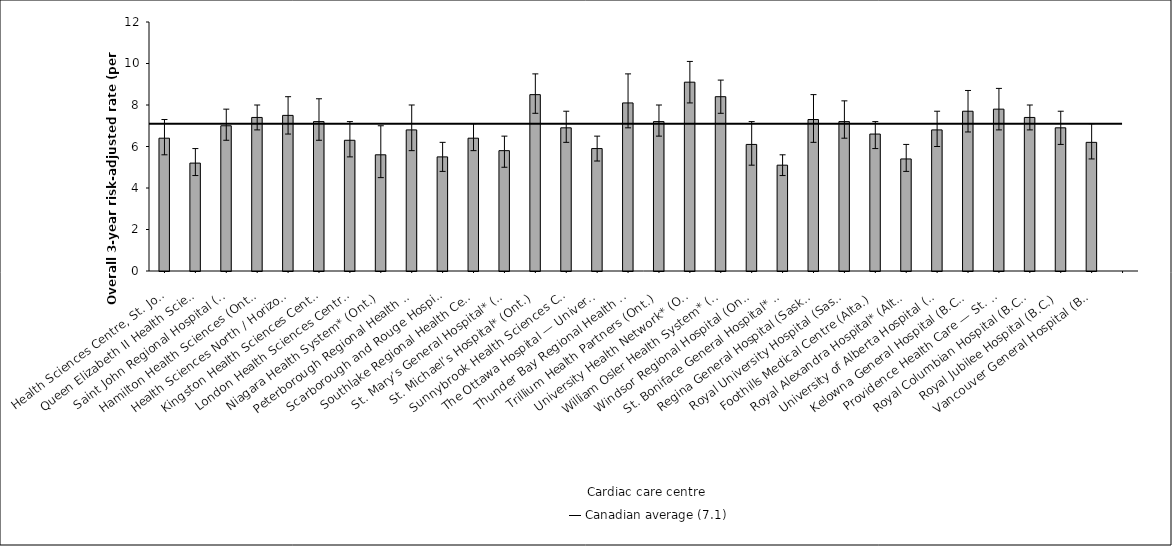
| Category | Risk-adjusted rate |
|---|---|
| Health Sciences Centre, St. John’s (N.L.) | 6.4 |
| Queen Elizabeth II Health Sciences Centre* (N.S.) | 5.2 |
| Saint John Regional Hospital (N.B.) | 7 |
| Hamilton Health Sciences (Ont.) | 7.4 |
| Health Sciences North / Horizon Santé-Nord (Ont.) | 7.5 |
| Kingston Health Sciences Centre (Ont.) | 7.2 |
| London Health Sciences Centre (Ont.) | 6.3 |
| Niagara Health System* (Ont.) | 5.6 |
| Peterborough Regional Health Centre (Ont.) | 6.8 |
| Scarborough and Rouge Hospital* (Ont.) | 5.5 |
| Southlake Regional Health Centre (Ont.) | 6.4 |
| St. Mary’s General Hospital* (Ont.) | 5.8 |
| St. Michael’s Hospital* (Ont.) | 8.5 |
| Sunnybrook Health Sciences Centre (Ont.) | 6.9 |
| The Ottawa Hospital — University of Ottawa Heart Institute* (Ont.) | 5.9 |
| Thunder Bay Regional Health Sciences Centre (Ont.) | 8.1 |
| Trillium Health Partners (Ont.) | 7.2 |
| University Health Network* (Ont.) | 9.1 |
| William Osler Health System* (Ont.) | 8.4 |
| Windsor Regional Hospital (Ont.) | 6.1 |
| St. Boniface General Hospital* (Man.) | 5.1 |
| Regina General Hospital (Sask.) | 7.3 |
| Royal University Hospital (Sask.) | 7.2 |
| Foothills Medical Centre (Alta.) | 6.6 |
| Royal Alexandra Hospital* (Alta.) | 5.4 |
| University of Alberta Hospital (Alta.) | 6.8 |
| Kelowna General Hospital (B.C.) | 7.7 |
| Providence Health Care — St. Paul’s Hospital (Vancouver) (B.C.) | 7.8 |
| Royal Columbian Hospital (B.C.) | 7.4 |
| Royal Jubilee Hospital (B.C.) | 6.9 |
| Vancouver General Hospital (B.C.) | 6.2 |